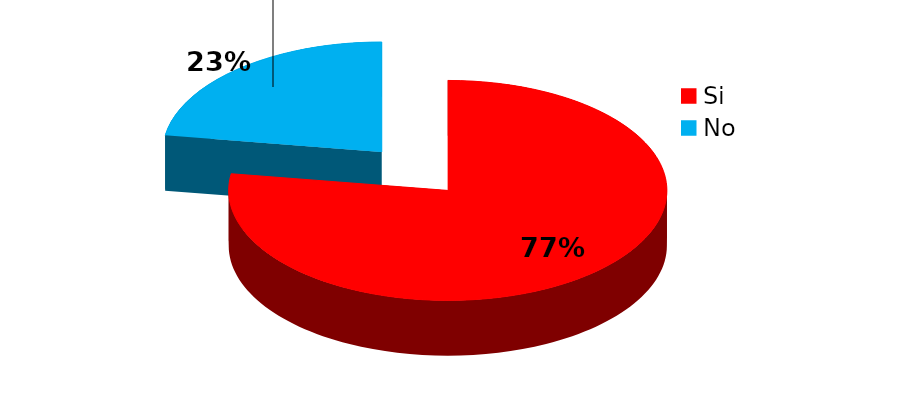
| Category | Series 0 |
|---|---|
| Si | 96 |
| No | 28 |